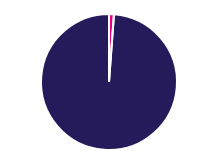
| Category | Series 0 |
|---|---|
| 0 | 3184 |
| 1 | 270715 |